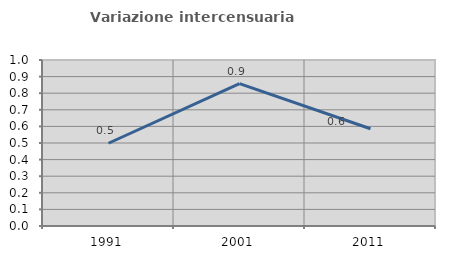
| Category | Variazione intercensuaria annua |
|---|---|
| 1991.0 | 0.498 |
| 2001.0 | 0.858 |
| 2011.0 | 0.586 |